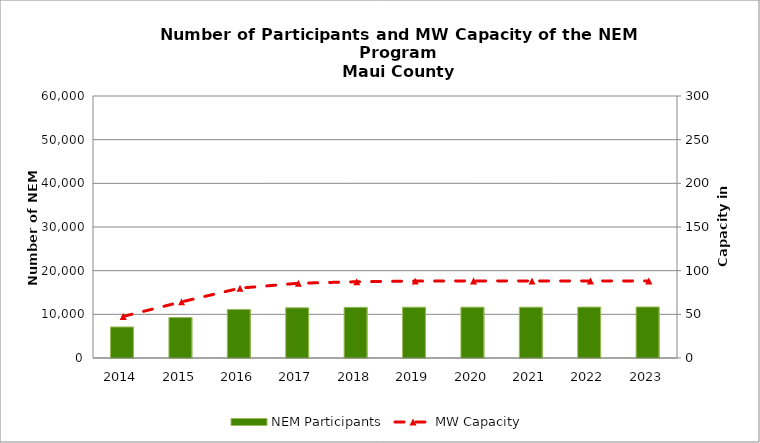
| Category | NEM Participants |
|---|---|
| 2014.0 | 7105 |
| 2015.0 | 9265 |
| 2016.0 | 11114 |
| 2017.0 | 11499 |
| 2018.0 | 11603 |
| 2019.0 | 11631 |
| 2020.0 | 11644 |
| 2021.0 | 11635 |
| 2022.0 | 11651 |
| 2023.0 | 11685 |